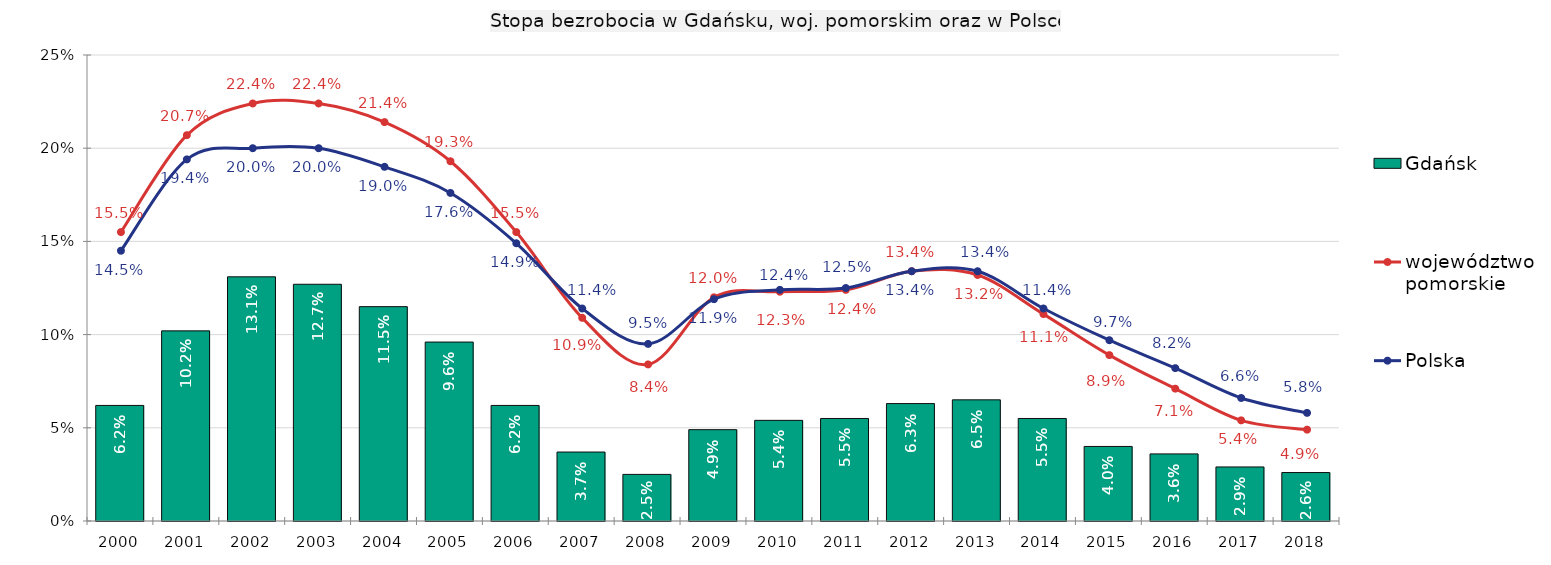
| Category | Gdańsk |
|---|---|
| 2000.0 | 0.062 |
| 2001.0 | 0.102 |
| 2002.0 | 0.131 |
| 2003.0 | 0.127 |
| 2004.0 | 0.115 |
| 2005.0 | 0.096 |
| 2006.0 | 0.062 |
| 2007.0 | 0.037 |
| 2008.0 | 0.025 |
| 2009.0 | 0.049 |
| 2010.0 | 0.054 |
| 2011.0 | 0.055 |
| 2012.0 | 0.063 |
| 2013.0 | 0.065 |
| 2014.0 | 0.055 |
| 2015.0 | 0.04 |
| 2016.0 | 0.036 |
| 2017.0 | 0.029 |
| 2018.0 | 0.026 |